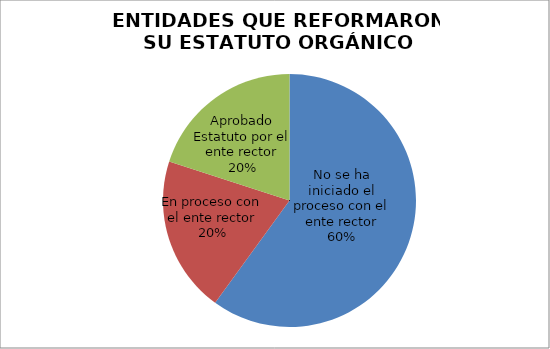
| Category | Series 0 |
|---|---|
| No se ha iniciado el proceso con el ente rector | 3 |
| En proceso con el ente rector | 1 |
| Aprobado Estatuto por el ente rector | 1 |